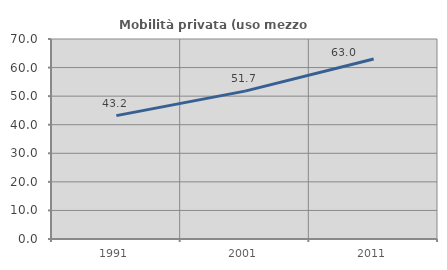
| Category | Mobilità privata (uso mezzo privato) |
|---|---|
| 1991.0 | 43.174 |
| 2001.0 | 51.747 |
| 2011.0 | 62.993 |